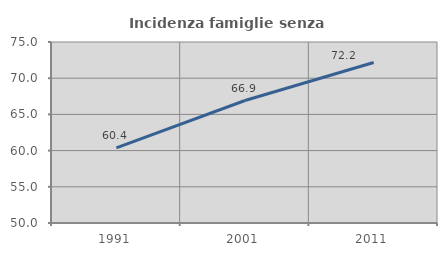
| Category | Incidenza famiglie senza nuclei |
|---|---|
| 1991.0 | 60.366 |
| 2001.0 | 66.917 |
| 2011.0 | 72.174 |